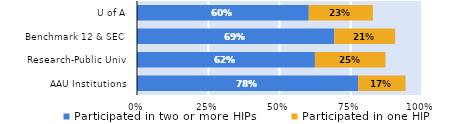
| Category | Participated in two or more HIPs | Participated in one HIP |
|---|---|---|
| AAU Institutions | 0.776 | 0.166 |
| Research-Public Univ | 0.624 | 0.248 |
| Benchmark 12 & SEC | 0.692 | 0.214 |
| U of A | 0.603 | 0.225 |